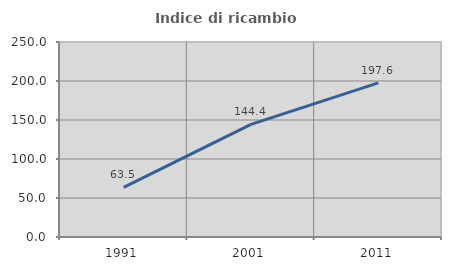
| Category | Indice di ricambio occupazionale  |
|---|---|
| 1991.0 | 63.514 |
| 2001.0 | 144.444 |
| 2011.0 | 197.561 |